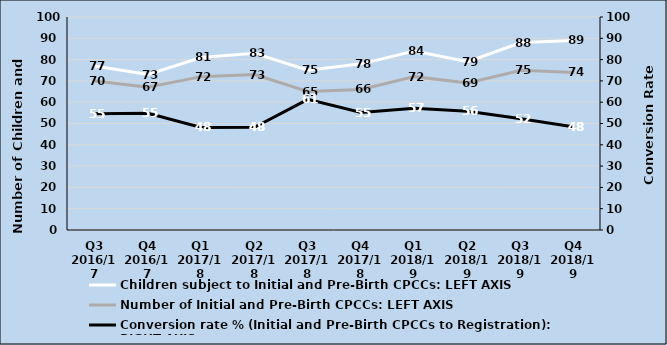
| Category | Children subject to Initial and Pre-Birth CPCCs: LEFT AXIS | Number of Initial and Pre-Birth CPCCs: LEFT AXIS |
|---|---|---|
| Q3 2016/17 | 77 | 70 |
| Q4 2016/17 | 73 | 67 |
| Q1 2017/18 | 81 | 72 |
| Q2 2017/18 | 83 | 73 |
| Q3 2017/18 | 75 | 65 |
| Q4 2017/18 | 78 | 66 |
| Q1 2018/19 | 84 | 72 |
| Q2 2018/19 | 79 | 69 |
| Q3 2018/19 | 88 | 75 |
| Q4 2018/19 | 89 | 74 |